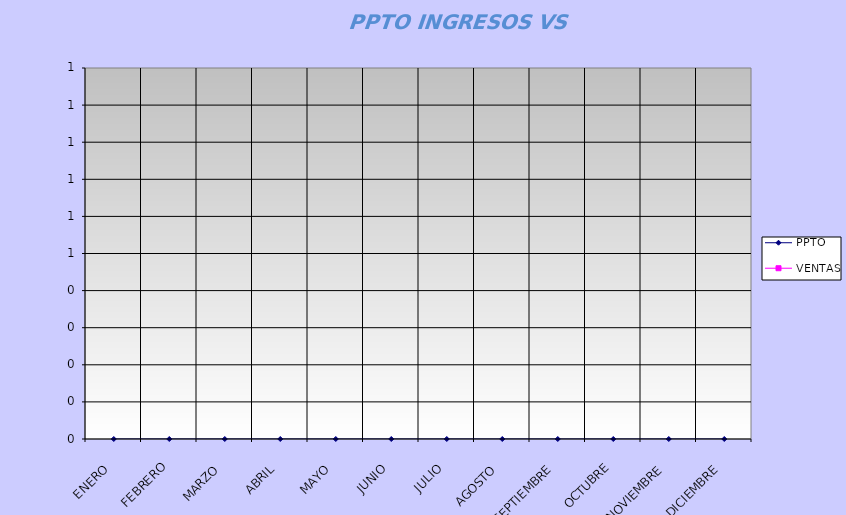
| Category | PPTO | VENTAS |
|---|---|---|
| ENERO | 0 |  |
| FEBRERO | 0 |  |
| MARZO | 0 |  |
| ABRIL | 0 |  |
| MAYO | 0 |  |
| JUNIO | 0 |  |
| JULIO | 0 |  |
| AGOSTO  | 0 |  |
| SEPTIEMBRE | 0 |  |
| OCTUBRE | 0 |  |
| NOVIEMBRE | 0 |  |
| DICIEMBRE | 0 |  |